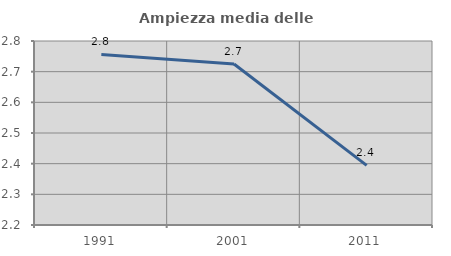
| Category | Ampiezza media delle famiglie |
|---|---|
| 1991.0 | 2.756 |
| 2001.0 | 2.725 |
| 2011.0 | 2.394 |